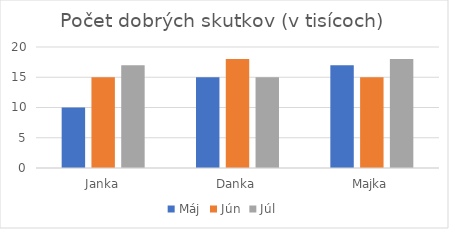
| Category | Máj | Jún | Júl |
|---|---|---|---|
| Janka | 10 | 15 | 17 |
| Danka | 15 | 18 | 15 |
| Majka | 17 | 15 | 18 |